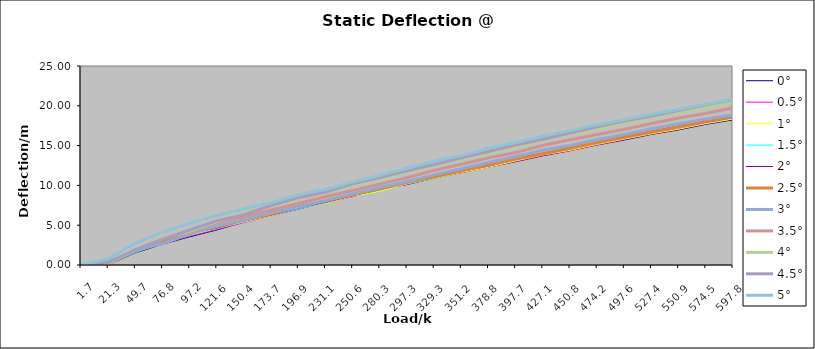
| Category | 0° | 0.5° | 1° | 1.5° | 2° | 2.5° | 3° | 3.5° | 4° | 4.5° | 5° |
|---|---|---|---|---|---|---|---|---|---|---|---|
| 1.7 | 0.002 | 0 | 0 | 0 | 0 | 0.02 | 0.03 | 0.01 | 0.03 | 0 | 0 |
| 21.3 | 0.05 | 0.17 | 0.35 | 0.1 | 0.19 | 0.18 | 0.43 | 0.21 | 0.17 | 0.27 | 0.77 |
| 49.7 | 1.51 | 1.63 | 1.72 | 1.53 | 1.79 | 1.81 | 1.81 | 1.84 | 1.93 | 1.92 | 2.75 |
| 76.8 | 2.61 | 2.64 | 2.79 | 2.82 | 2.9 | 2.95 | 2.7 | 3.36 | 3.33 | 3.22 | 4.12 |
| 97.2 | 3.54 | 3.65 | 3.73 | 3.86 | 4.03 | 4.09 | 3.88 | 4.18 | 4.24 | 4.4 | 5.24 |
| 121.6 | 4.4 | 4.46 | 4.6 | 4.61 | 4.65 | 4.79 | 4.92 | 5.29 | 5.41 | 5.55 | 6.2 |
| 150.4 | 5.42 | 5.33 | 5.4 | 5.48 | 5.59 | 5.66 | 5.64 | 6.1 | 6.56 | 6.32 | 7.06 |
| 173.7 | 6.25 | 6.18 | 6.18 | 6.27 | 6.27 | 6.41 | 6.56 | 6.91 | 7.34 | 7.48 | 7.83 |
| 196.9 | 7.03 | 7.04 | 7.1 | 7.05 | 7.16 | 7.32 | 7.25 | 7.73 | 8.29 | 8.46 | 8.81 |
| 231.1 | 7.95 | 7.82 | 7.76 | 7.83 | 7.88 | 8.02 | 8.12 | 8.58 | 9.09 | 9.17 | 9.49 |
| 250.6 | 8.63 | 8.57 | 8.63 | 8.74 | 8.71 | 8.85 | 8.91 | 9.35 | 9.97 | 10.2 | 10.43 |
| 280.3 | 9.47 | 9.55 | 9.26 | 9.44 | 9.57 | 9.57 | 9.73 | 10.16 | 10.76 | 10.98 | 11.25 |
| 297.3 | 10.12 | 10.11 | 10.19 | 10.25 | 10.37 | 10.39 | 10.48 | 10.97 | 11.62 | 11.85 | 12.15 |
| 329.3 | 10.89 | 10.97 | 10.87 | 10.93 | 11.1 | 11.09 | 11.32 | 11.89 | 12.42 | 12.62 | 13.03 |
| 351.2 | 11.61 | 11.59 | 11.62 | 11.74 | 11.91 | 11.84 | 12.1 | 12.65 | 13.27 | 13.47 | 13.74 |
| 378.8 | 12.3 | 12.35 | 12.28 | 12.53 | 12.54 | 12.61 | 12.88 | 13.46 | 13.99 | 14.26 | 14.66 |
| 397.7 | 12.98 | 13.02 | 13.07 | 13.29 | 13.42 | 13.32 | 13.63 | 14.13 | 14.85 | 15.08 | 15.38 |
| 427.1 | 13.72 | 13.76 | 13.82 | 13.92 | 14.04 | 13.97 | 14.42 | 15.03 | 15.62 | 15.8 | 16.18 |
| 450.8 | 14.36 | 14.38 | 14.4 | 14.69 | 14.78 | 14.67 | 15.03 | 15.73 | 16.4 | 16.58 | 16.85 |
| 474.2 | 15.08 | 15.11 | 15.15 | 15.4 | 15.44 | 15.39 | 15.77 | 16.4 | 17.01 | 17.35 | 17.6 |
| 497.6 | 15.7 | 15.78 | 15.81 | 16.01 | 16.18 | 16.06 | 16.4 | 17.04 | 17.77 | 18.1 | 18.23 |
| 527.4 | 16.41 | 16.47 | 16.48 | 16.73 | 16.81 | 16.71 | 17.12 | 17.77 | 18.51 | 18.73 | 18.95 |
| 550.9 | 16.97 | 17.07 | 17.06 | 17.36 | 17.45 | 17.35 | 17.74 | 18.46 | 19.12 | 19.42 | 19.53 |
| 574.5 | 17.67 | 17.86 | 17.75 | 18.03 | 18.1 | 18.08 | 18.35 | 19.03 | 19.78 | 20.13 | 20.2 |
| 597.8 | 18.23 | 18.49 | 18.33 | 18.58 | 18.73 | 18.63 | 18.85 | 19.74 | 20.41 | 20.76 | 20.83 |